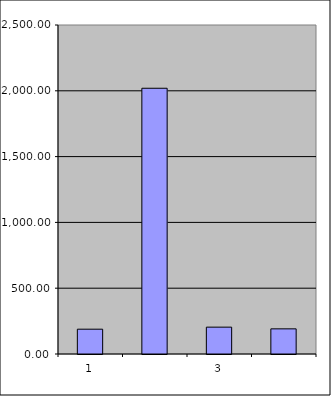
| Category | Series 0 |
|---|---|
| 0 | 188.5 |
| 1 | 2019.342 |
| 2 | 204.04 |
| 3 | 191.14 |